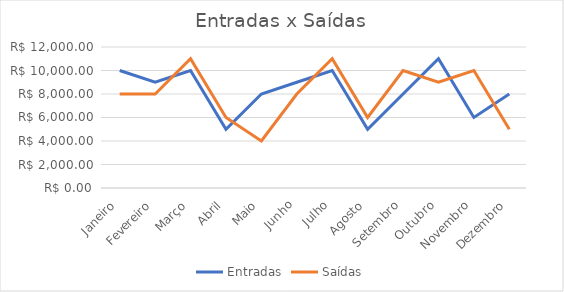
| Category | Entradas | Saídas |
|---|---|---|
| Janeiro | 10000 | 8000 |
| Fevereiro | 9000 | 8000 |
| Março | 10000 | 11000 |
| Abril | 5000 | 6000 |
| Maio | 8000 | 4000 |
| Junho | 9000 | 8000 |
| Julho | 10000 | 11000 |
| Agosto | 5000 | 6000 |
| Setembro | 8000 | 10000 |
| Outubro | 11000 | 9000 |
| Novembro | 6000 | 10000 |
| Dezembro | 8000 | 5000 |